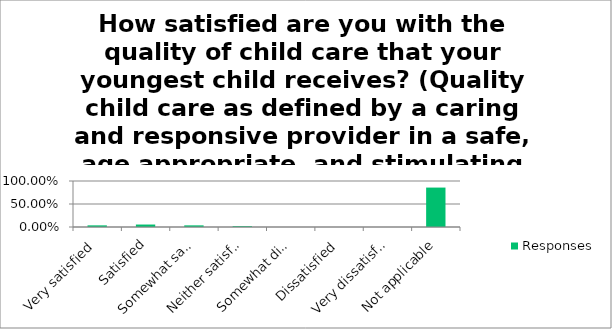
| Category | Responses |
|---|---|
| Very satisfied | 0.036 |
| Satisfied | 0.054 |
| Somewhat satisfied | 0.036 |
| Neither satisfied nor dissatisfied | 0.018 |
| Somewhat dissatisfied | 0 |
| Dissatisfied | 0 |
| Very dissatisfied | 0 |
| Not applicable | 0.857 |